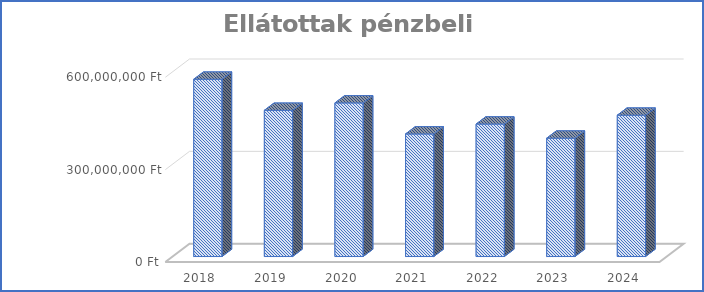
| Category | Ellátottak pénzbeli juttatásai |
|---|---|
| 2018.0 | 575850000 |
| 2019.0 | 474840000 |
| 2020.0 | 498932891 |
| 2021.0 | 398080000 |
| 2022.0 | 430280877 |
| 2023.0 | 384407330 |
| 2024.0 | 458993244 |